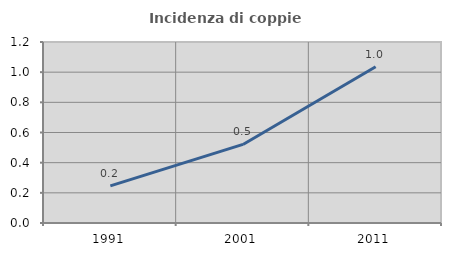
| Category | Incidenza di coppie miste |
|---|---|
| 1991.0 | 0.247 |
| 2001.0 | 0.521 |
| 2011.0 | 1.036 |